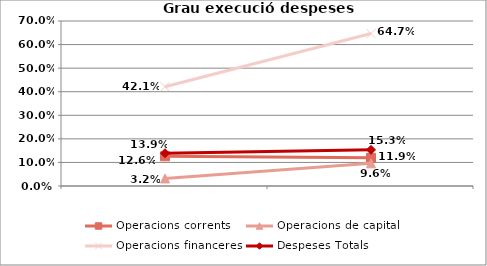
| Category | Operacions corrents | Operacions de capital | Operacions financeres | Despeses Totals |
|---|---|---|---|---|
|  | 0.126 | 0.032 | 0.421 | 0.139 |
|  | 0.119 | 0.096 | 0.647 | 0.153 |